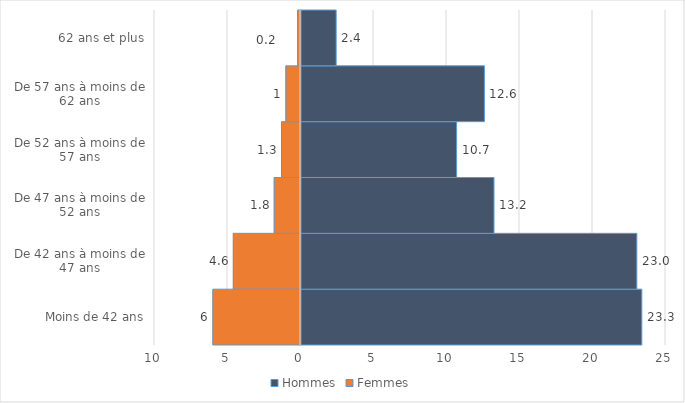
| Category | Hommes | Femmes |
|---|---|---|
| Moins de 42 ans | 23.344 | -6 |
| De 42 ans à moins de 47 ans | 23.002 | -4.6 |
| De 47 ans à moins de 52 ans | 13.218 | -1.8 |
| De 52 ans à moins de 57 ans | 10.66 | -1.3 |
| De 57 ans à moins de 62 ans | 12.562 | -1 |
| 62 ans et plus | 2.408 | -0.2 |